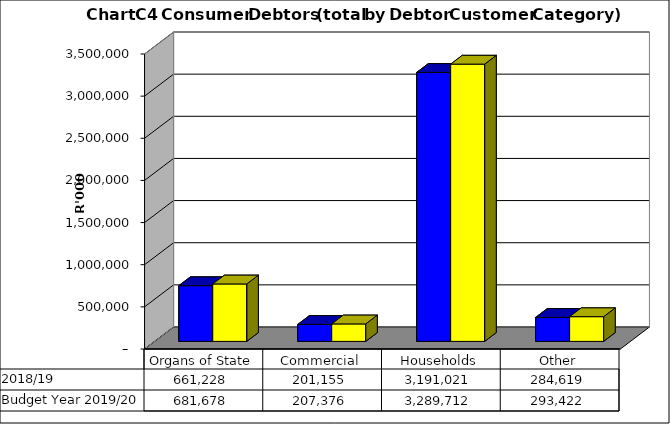
| Category |  2018/19  | Budget Year 2019/20 |
|---|---|---|
| Organs of State | 661227995.125 | 681678345.49 |
| Commercial | 201154939.715 | 207376226.51 |
| Households | 3191020690.11 | 3289712051.66 |
| Other | 284619142.605 | 293421796.5 |